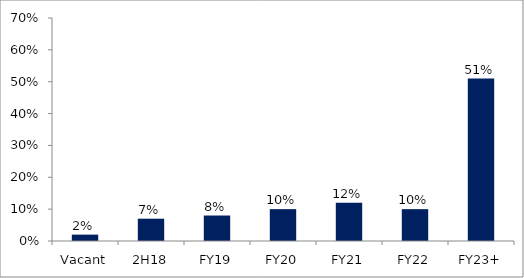
| Category | Series 0 |
|---|---|
| Vacant | 0.02 |
| 2H18 | 0.07 |
| FY19 | 0.08 |
| FY20 | 0.1 |
| FY21 | 0.12 |
| FY22 | 0.1 |
| FY23+ | 0.51 |